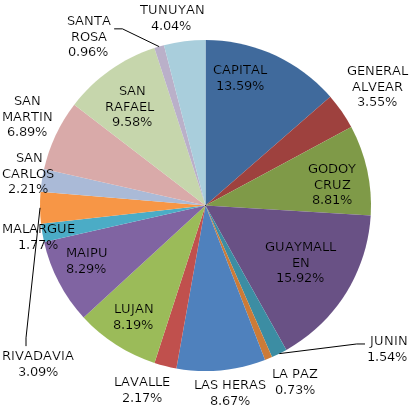
| Category | Total Quiniela Recaudación  |
|---|---|
| CAPITAL | 16262446 |
| GENERAL ALVEAR | 4252591 |
| GODOY CRUZ | 10537464 |
| GUAYMALLEN | 19048920 |
| JUNIN | 1843581 |
| LA PAZ | 871893 |
| LAS HERAS | 10378565 |
| LAVALLE | 2597030 |
| LUJAN | 9795325 |
| MAIPU | 9920104 |
| MALARGUE | 2111836 |
| RIVADAVIA | 3703094 |
| SAN CARLOS | 2643995 |
| SAN MARTIN | 8241734 |
| SAN RAFAEL  | 11461346 |
| SANTA ROSA | 1147619 |
| TUNUYAN | 4832503 |